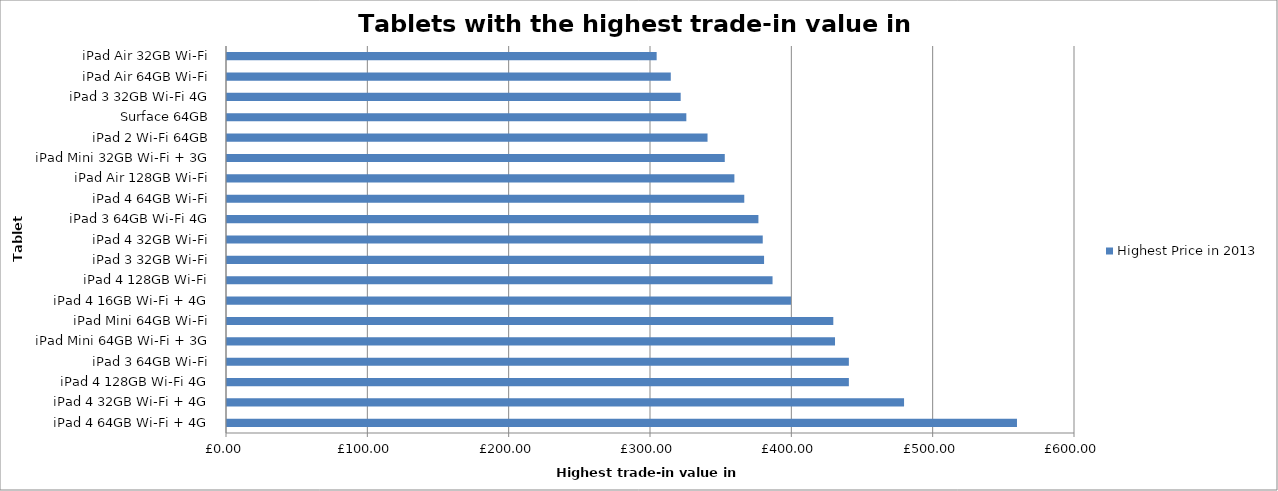
| Category | Highest Price in 2013 |
|---|---|
| iPad 4 64GB Wi-Fi + 4G | 558.95 |
| iPad 4 32GB Wi-Fi + 4G | 479.05 |
| iPad 4 128GB Wi-Fi 4G | 440 |
| iPad 3 64GB Wi-Fi | 440 |
| iPad Mini 64GB Wi-Fi + 3G | 430.2 |
| iPad Mini 64GB Wi-Fi | 428.99 |
| iPad 4 16GB Wi-Fi + 4G | 399.03 |
| iPad 4 128GB Wi-Fi | 386 |
| iPad 3 32GB Wi-Fi | 380 |
| iPad 4 32GB Wi-Fi | 379.06 |
| iPad 3 64GB Wi-Fi 4G | 376 |
| iPad 4 64GB Wi-Fi | 366 |
| iPad Air 128GB Wi-Fi | 359 |
| iPad Mini 32GB Wi-Fi + 3G | 352.2 |
| iPad 2 Wi-Fi 64GB | 340 |
| Surface 64GB | 325 |
| iPad 3 32GB Wi-Fi 4G | 321 |
| iPad Air 64GB Wi-Fi | 314 |
| iPad Air 32GB Wi-Fi | 304 |